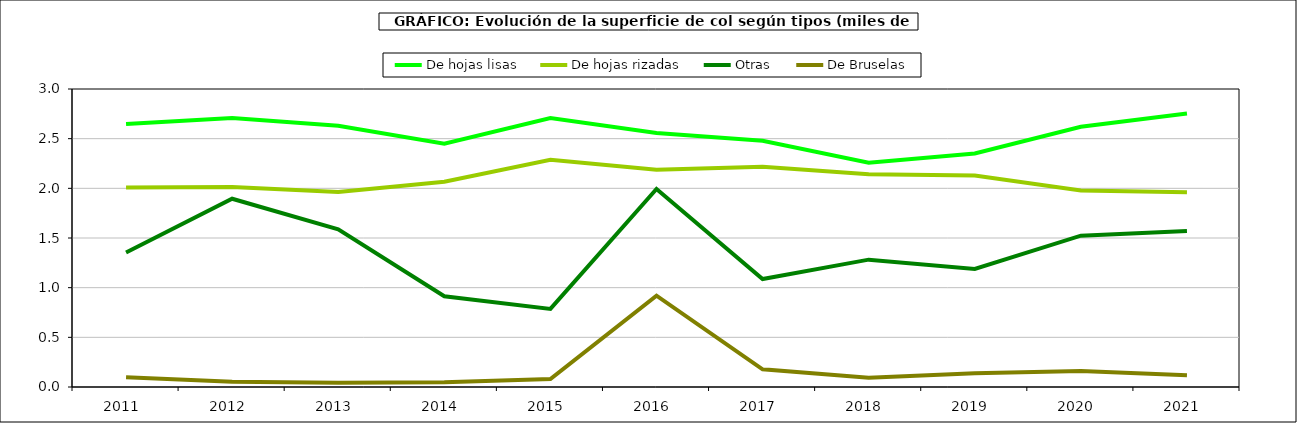
| Category | De hojas lisas | De hojas rizadas | Otras | De Bruselas |
|---|---|---|---|---|
| 2011.0 | 2.648 | 2.008 | 1.354 | 0.098 |
| 2012.0 | 2.707 | 2.014 | 1.895 | 0.053 |
| 2013.0 | 2.631 | 1.962 | 1.588 | 0.043 |
| 2014.0 | 2.45 | 2.067 | 0.914 | 0.048 |
| 2015.0 | 2.707 | 2.288 | 0.786 | 0.08 |
| 2016.0 | 2.557 | 2.186 | 1.994 | 0.92 |
| 2017.0 | 2.479 | 2.218 | 1.087 | 0.178 |
| 2018.0 | 2.257 | 2.141 | 1.282 | 0.094 |
| 2019.0 | 2.351 | 2.128 | 1.188 | 0.139 |
| 2020.0 | 2.62 | 1.979 | 1.523 | 0.16 |
| 2021.0 | 2.753 | 1.96 | 1.57 | 0.118 |